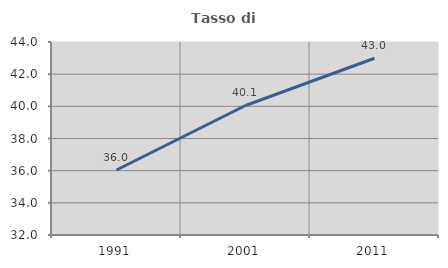
| Category | Tasso di occupazione   |
|---|---|
| 1991.0 | 36.041 |
| 2001.0 | 40.053 |
| 2011.0 | 42.99 |